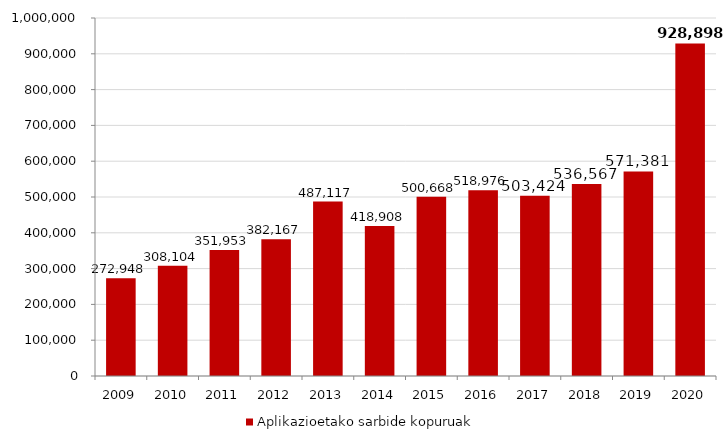
| Category | Aplikazioetako sarbide kopuruak |
|---|---|
| 2009.0 | 272948 |
| 2010.0 | 308104 |
| 2011.0 | 351953 |
| 2012.0 | 382167 |
| 2013.0 | 487117 |
| 2014.0 | 418908 |
| 2015.0 | 500668 |
| 2016.0 | 518976 |
| 2017.0 | 503424 |
| 2018.0 | 536567 |
| 2019.0 | 571381 |
| 2020.0 | 928898 |